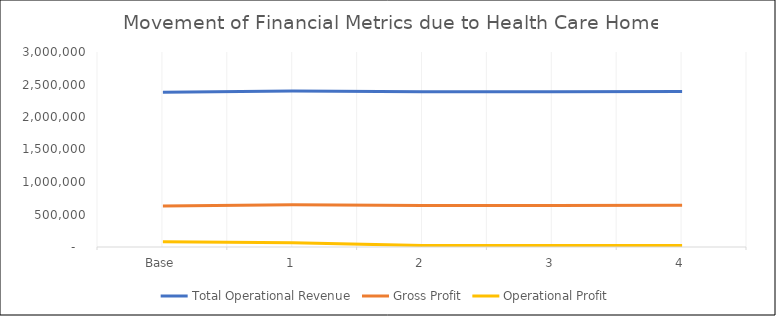
| Category |  Total Operational Revenue  |  Gross Profit  |  Operational Profit  |
|---|---|---|---|
| Base | 2380000 | 630000 | 80000 |
| 1 | 2398869.635 | 648869.635 | 64812.988 |
| 2 | 2390034.711 | 640034.711 | 21720.023 |
| 3 | 2389783.598 | 639783.598 | 21468.91 |
| 4 | 2392901.45 | 642901.45 | 24586.763 |